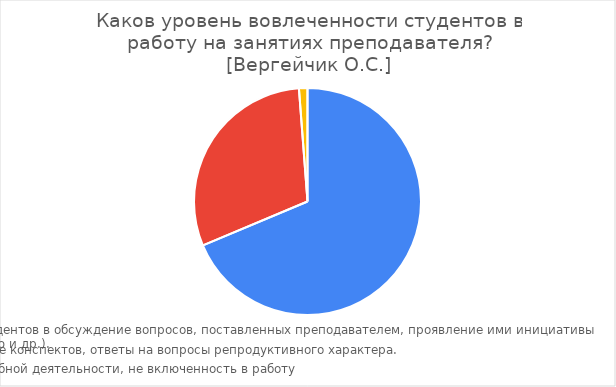
| Category | Series 0 |
|---|---|
| Высокий (активный). Включение студентов в обсуждение вопросов, поставленных преподавателем, проявление ими инициативы (постановка вопросов преподавателю и др.). | 57 |
| Средний (исполнительский). Ведение конспектов, ответы на вопросы репродуктивного характера. | 25 |
| Низкий (пассивный). Отсутствие учебной деятельности, не включенность в работу | 1 |